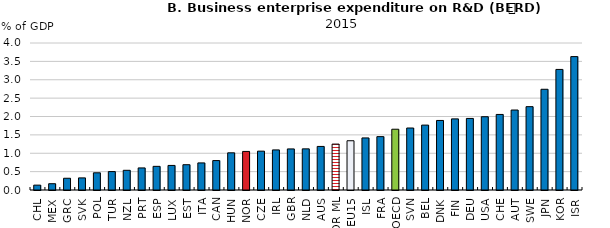
| Category | Series 0 |
|---|---|
| CHL | 0.132 |
| MEX | 0.171 |
| GRC | 0.32 |
| SVK | 0.329 |
| POL | 0.468 |
| TUR | 0.501 |
| NZL | 0.536 |
| PRT | 0.601 |
| ESP | 0.643 |
| LUX | 0.669 |
| EST | 0.688 |
| ITA | 0.737 |
| CAN | 0.801 |
| HUN | 1.012 |
| NOR | 1.05 |
| CZE | 1.057 |
| IRL | 1.091 |
| GBR | 1.118 |
| NLD | 1.12 |
| AUS | 1.186 |
| NOR ML | 1.249 |
| EU15 | 1.34 |
| ISL | 1.417 |
| FRA | 1.452 |
| OECD | 1.654 |
| SVN | 1.687 |
| BEL | 1.766 |
| DNK | 1.892 |
| FIN | 1.935 |
| DEU | 1.947 |
| USA | 1.994 |
| CHE | 2.056 |
| AUT | 2.176 |
| SWE | 2.268 |
| JPN | 2.741 |
| KOR | 3.281 |
| ISR | 3.63 |